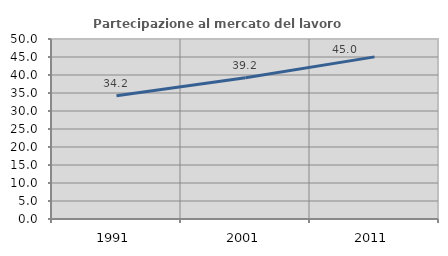
| Category | Partecipazione al mercato del lavoro  femminile |
|---|---|
| 1991.0 | 34.247 |
| 2001.0 | 39.213 |
| 2011.0 | 45.032 |